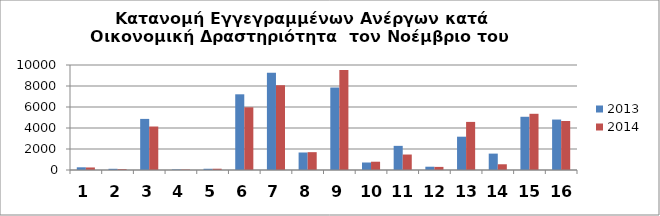
| Category | 2013 | 2014 |
|---|---|---|
| 0 | 257 | 242 |
| 1 | 115 | 83 |
| 2 | 4867 | 4142 |
| 3 | 52 | 43 |
| 4 | 118 | 122 |
| 5 | 7209 | 5972 |
| 6 | 9260 | 8075 |
| 7 | 1667 | 1699 |
| 8 | 7856 | 9520 |
| 9 | 714 | 789 |
| 10 | 2299 | 1474 |
| 11 | 313 | 296 |
| 12 | 3172 | 4580 |
| 13 | 1561 | 546 |
| 14 | 5069 | 5353 |
| 15 | 4805 | 4667 |